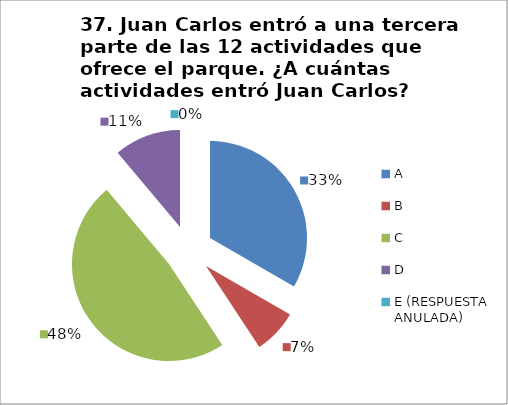
| Category | CANTIDAD DE RESPUESTAS PREGUNTA (37) | PORCENTAJE |
|---|---|---|
| A | 9 | 0.333 |
| B | 2 | 0.074 |
| C | 13 | 0.481 |
| D | 3 | 0.111 |
| E (RESPUESTA ANULADA) | 0 | 0 |